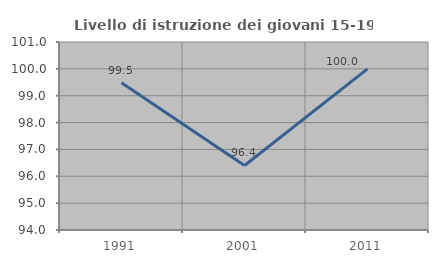
| Category | Livello di istruzione dei giovani 15-19 anni |
|---|---|
| 1991.0 | 99.479 |
| 2001.0 | 96.403 |
| 2011.0 | 100 |